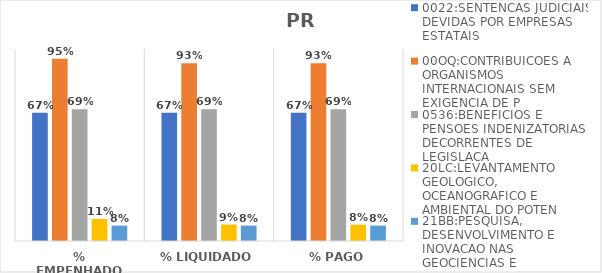
| Category | 0022:SENTENCAS JUDICIAIS DEVIDAS POR EMPRESAS ESTATAIS | 00OQ:CONTRIBUICOES A ORGANISMOS INTERNACIONAIS SEM EXIGENCIA DE P | 0536:BENEFICIOS E PENSOES INDENIZATORIAS DECORRENTES DE LEGISLACA | 20LC:LEVANTAMENTO GEOLOGICO, OCEANOGRAFICO E AMBIENTAL DO POTEN | 21BB:PESQUISA, DESENVOLVIMENTO E INOVACAO NAS GEOCIENCIAS E |
|---|---|---|---|---|---|
| % EMPENHADO | 0.668 | 0.95 | 0.687 | 0.115 | 0.08 |
| % LIQUIDADO | 0.668 | 0.926 | 0.687 | 0.086 | 0.08 |
| % PAGO | 0.668 | 0.926 | 0.687 | 0.085 | 0.08 |